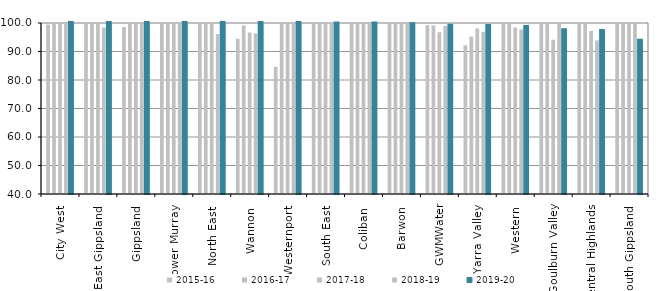
| Category | 2015-16 | 2016-17 | 2017-18 | 2018-19 | 2019-20 |
|---|---|---|---|---|---|
| City West  | 99.465 | 100 | 100 | 100 | 100 |
| East Gippsland  | 100 | 100 | 100 | 98.413 | 100 |
| Gippsland  | 98.592 | 100 | 100 | 100 | 100 |
| Lower Murray  | 100 | 100 | 100 | 100 | 100 |
| North East  | 100 | 100 | 100 | 96.104 | 100 |
| Wannon  | 94.444 | 99.153 | 96.703 | 96.296 | 100 |
| Westernport  | 84.615 | 100 | 100 | 100 | 100 |
| South East  | 100 | 99.895 | 100 | 99.899 | 99.809 |
| Coliban  | 100 | 100 | 100 | 100 | 99.786 |
| Barwon  | 100 | 100 | 99.681 | 100 | 99.573 |
| GWMWater | 99.248 | 99.107 | 96.774 | 98.98 | 99.02 |
| Yarra Valley  | 92.175 | 95.246 | 98.082 | 96.962 | 98.973 |
| Western  | 100 | 100 | 98.387 | 97.701 | 98.611 |
| Goulburn Valley  | 100 | 100 | 94.118 | 100 | 97.436 |
| Central Highlands  | 100 | 100 | 97.222 | 93.902 | 97.196 |
| South Gippsland  | 100 | 100 | 100 | 100 | 93.75 |